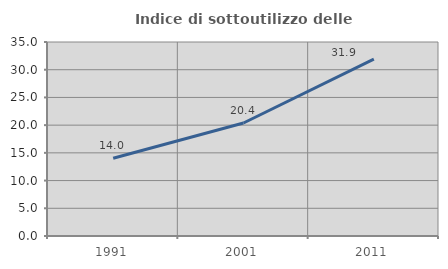
| Category | Indice di sottoutilizzo delle abitazioni  |
|---|---|
| 1991.0 | 14.026 |
| 2001.0 | 20.385 |
| 2011.0 | 31.917 |